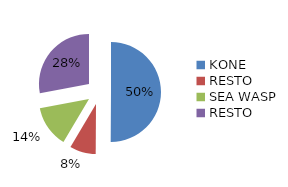
| Category | Series 0 |
|---|---|
| KONE | 0.501 |
| RESTO | 0.084 |
| SEA WASP | 0.135 |
| RESTO | 0.28 |